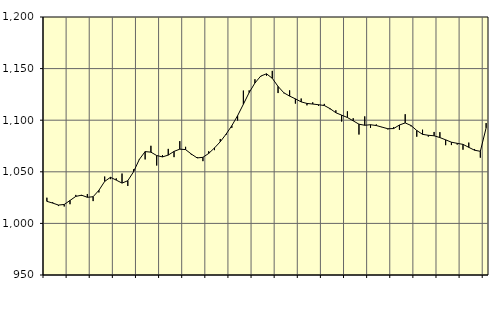
| Category | Piggar | Series 1 |
|---|---|---|
| nan | 1024.9 | 1021.36 |
| 1.0 | 1020.5 | 1019.7 |
| 1.0 | 1016.8 | 1017.78 |
| 1.0 | 1016.4 | 1018.34 |
| nan | 1018.6 | 1022.22 |
| 2.0 | 1027.6 | 1026.17 |
| 2.0 | 1026.6 | 1027.33 |
| 2.0 | 1028.5 | 1025.29 |
| nan | 1021.6 | 1025.85 |
| 3.0 | 1030 | 1032.08 |
| 3.0 | 1045.4 | 1040.68 |
| 3.0 | 1042.9 | 1044.65 |
| nan | 1043.6 | 1041.96 |
| 4.0 | 1048.3 | 1039.05 |
| 4.0 | 1036.3 | 1041.36 |
| 4.0 | 1052.4 | 1050.04 |
| nan | 1061.6 | 1062.05 |
| 5.0 | 1062 | 1069.59 |
| 5.0 | 1075.2 | 1069.02 |
| 5.0 | 1056.1 | 1065.77 |
| nan | 1066.2 | 1064.43 |
| 6.0 | 1072.2 | 1066.2 |
| 6.0 | 1064.2 | 1069.78 |
| 6.0 | 1079.7 | 1071.93 |
| nan | 1074.2 | 1071.51 |
| 7.0 | 1066.5 | 1067.18 |
| 7.0 | 1064.3 | 1063.44 |
| 7.0 | 1060.3 | 1064.03 |
| nan | 1069.9 | 1067.8 |
| 8.0 | 1071 | 1073.13 |
| 8.0 | 1081.8 | 1079.12 |
| 8.0 | 1085.7 | 1086.42 |
| nan | 1092.6 | 1094.68 |
| 9.0 | 1099.7 | 1104.4 |
| 9.0 | 1128.7 | 1115.47 |
| 9.0 | 1128.9 | 1126.77 |
| nan | 1139.7 | 1136.06 |
| 10.0 | 1142.2 | 1142.74 |
| 10.0 | 1143.1 | 1144.95 |
| 10.0 | 1147.8 | 1140.62 |
| nan | 1126.3 | 1132.73 |
| 11.0 | 1126.1 | 1126.56 |
| 11.0 | 1128.9 | 1123.35 |
| 11.0 | 1116.1 | 1120.68 |
| nan | 1121 | 1117.74 |
| 12.0 | 1114.4 | 1116.23 |
| 12.0 | 1117.3 | 1115.65 |
| 12.0 | 1113.9 | 1114.99 |
| nan | 1115.8 | 1114.23 |
| 13.0 | 1110.6 | 1111.19 |
| 13.0 | 1109.6 | 1107.23 |
| 13.0 | 1098.7 | 1104.91 |
| nan | 1108.6 | 1102.59 |
| 14.0 | 1101.9 | 1099.38 |
| 14.0 | 1086.1 | 1096.15 |
| 14.0 | 1103.7 | 1095.08 |
| nan | 1092.6 | 1095.61 |
| 15.0 | 1095.9 | 1094.83 |
| 15.0 | 1093.4 | 1093.28 |
| 15.0 | 1091.1 | 1091.73 |
| nan | 1093.3 | 1091.9 |
| 16.0 | 1090.7 | 1095.34 |
| 16.0 | 1105.8 | 1097.37 |
| 16.0 | 1094.1 | 1094.89 |
| nan | 1084 | 1090.03 |
| 17.0 | 1090.8 | 1086.3 |
| 17.0 | 1084.1 | 1085.38 |
| 17.0 | 1088.6 | 1084.91 |
| nan | 1088.4 | 1083.17 |
| 18.0 | 1075.8 | 1080.97 |
| 18.0 | 1075.9 | 1078.68 |
| 18.0 | 1076.4 | 1077.58 |
| nan | 1071.4 | 1076.58 |
| 19.0 | 1078.3 | 1073.71 |
| 19.0 | 1072.1 | 1070.9 |
| 19.0 | 1063.7 | 1069.86 |
| nan | 1097.2 | 1092.53 |